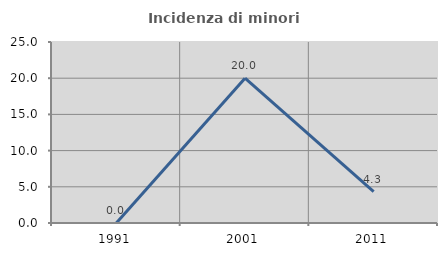
| Category | Incidenza di minori stranieri |
|---|---|
| 1991.0 | 0 |
| 2001.0 | 20 |
| 2011.0 | 4.348 |